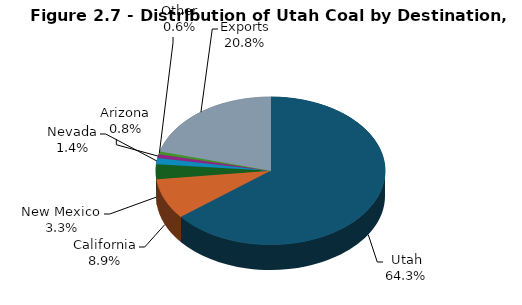
| Category | Series 0 |
|---|---|
| Utah | 9655 |
| California | 1332 |
| New Mexico | 491 |
| Nevada | 205 |
| Arizona | 119 |
| Other | 95 |
| Exports | 3123 |